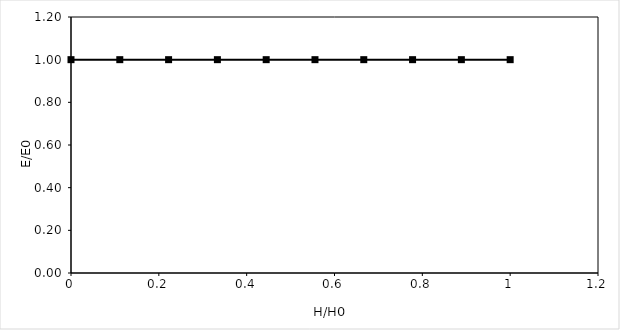
| Category | Head (feet) |
|---|---|
| 1.0 | 1 |
| 0.8888888888888888 | 1 |
| 0.7777777777777778 | 1 |
| 0.6666666666666666 | 1 |
| 0.5555555555555556 | 1 |
| 0.4444444444444444 | 1 |
| 0.3333333333333333 | 1 |
| 0.2222222222222222 | 1 |
| 0.1111111111111111 | 1 |